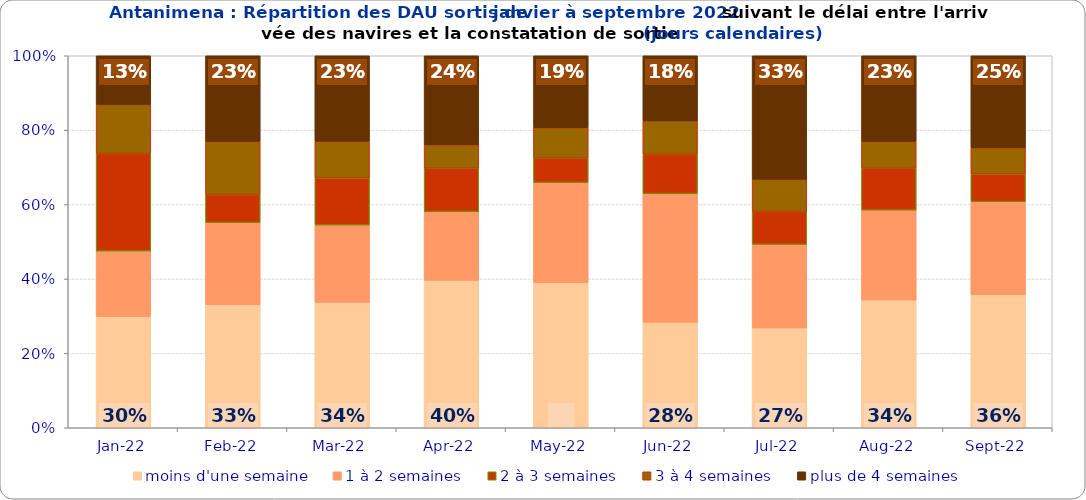
| Category | moins d'une semaine | 1 à 2 semaines | 2 à 3 semaines | 3 à 4 semaines | plus de 4 semaines |
|---|---|---|---|---|---|
| 2022-01-01 | 0.299 | 0.176 | 0.262 | 0.132 | 0.131 |
| 2022-02-01 | 0.331 | 0.221 | 0.075 | 0.143 | 0.23 |
| 2022-03-01 | 0.337 | 0.208 | 0.126 | 0.099 | 0.23 |
| 2022-04-01 | 0.396 | 0.185 | 0.117 | 0.063 | 0.239 |
| 2022-05-01 | 0.39 | 0.269 | 0.065 | 0.082 | 0.193 |
| 2022-06-01 | 0.284 | 0.346 | 0.106 | 0.09 | 0.175 |
| 2022-07-01 | 0.268 | 0.225 | 0.088 | 0.087 | 0.332 |
| 2022-08-01 | 0.343 | 0.242 | 0.112 | 0.072 | 0.23 |
| 2022-09-01 | 0.357 | 0.25 | 0.075 | 0.07 | 0.247 |